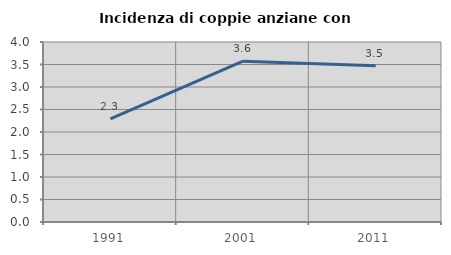
| Category | Incidenza di coppie anziane con figli |
|---|---|
| 1991.0 | 2.294 |
| 2001.0 | 3.573 |
| 2011.0 | 3.474 |